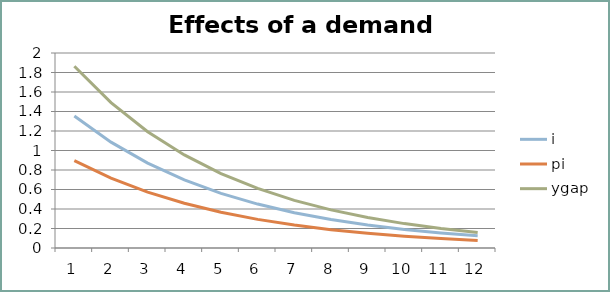
| Category | i | pi | ygap |
|---|---|---|---|
| 0 | 1.354 | 0.896 | 1.864 |
| 1 | 1.085 | 0.717 | 1.491 |
| 2 | 0.87 | 0.573 | 1.193 |
| 3 | 0.698 | 0.459 | 0.954 |
| 4 | 0.561 | 0.367 | 0.763 |
| 5 | 0.451 | 0.294 | 0.611 |
| 6 | 0.362 | 0.235 | 0.489 |
| 7 | 0.292 | 0.188 | 0.391 |
| 8 | 0.236 | 0.15 | 0.313 |
| 9 | 0.191 | 0.12 | 0.25 |
| 10 | 0.154 | 0.096 | 0.2 |
| 11 | 0.126 | 0.077 | 0.16 |